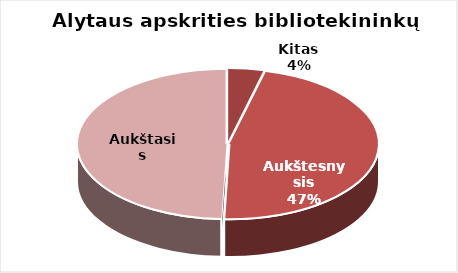
| Category | Series 0 |
|---|---|
| Kitas | 7 |
| Aukštesnysis | 83 |
| Aukštasis | 88 |